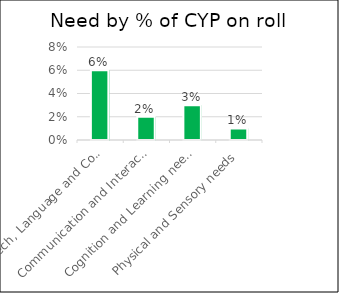
| Category | Series 0 |
|---|---|
| Speech, Language and Communication needs (SCLN) | 0.06 |
| Communication and Interaction needs (including ASD) | 0.02 |
| Cognition and Learning needs (C&L) | 0.03 |
|  Physical and Sensory needs | 0.01 |